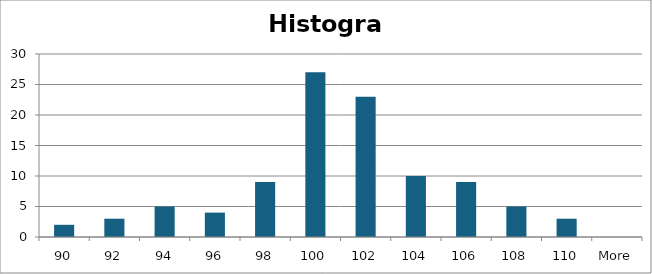
| Category | Frequency |
|---|---|
| 90 | 2 |
| 92 | 3 |
| 94 | 5 |
| 96 | 4 |
| 98 | 9 |
| 100 | 27 |
| 102 | 23 |
| 104 | 10 |
| 106 | 9 |
| 108 | 5 |
| 110 | 3 |
| More | 0 |